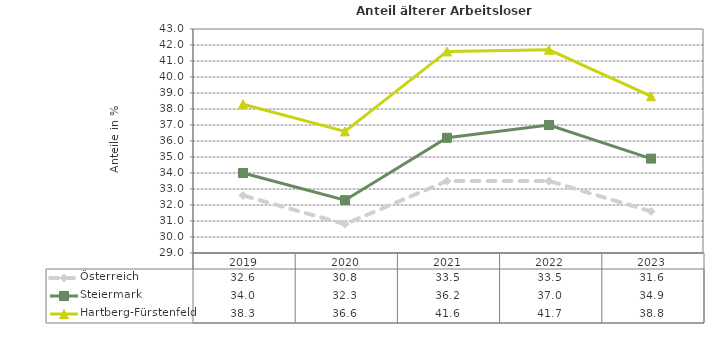
| Category | Österreich | Steiermark | Hartberg-Fürstenfeld |
|---|---|---|---|
| 2023.0 | 31.6 | 34.9 | 38.8 |
| 2022.0 | 33.5 | 37 | 41.7 |
| 2021.0 | 33.5 | 36.2 | 41.6 |
| 2020.0 | 30.8 | 32.3 | 36.6 |
| 2019.0 | 32.6 | 34 | 38.3 |